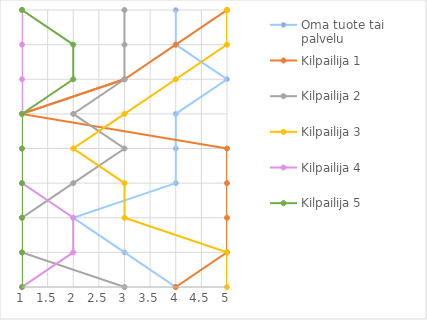
| Category | Series 6 |
|---|---|
| Kiinnostava tuote | 5 |
| Halpa tuote | 5 |
| Saatavilla helposti | 5 |
| Informatiivinen | 5 |
| Ajankohtainen | 5 |
| kuudes | 5 |
| seitsemäs | 5 |
| kahdeksas | 5 |
| yhdeksäs | 5 |